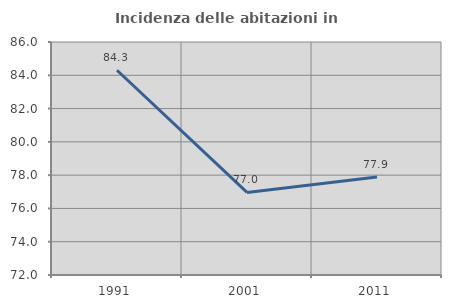
| Category | Incidenza delle abitazioni in proprietà  |
|---|---|
| 1991.0 | 84.301 |
| 2001.0 | 76.961 |
| 2011.0 | 77.887 |